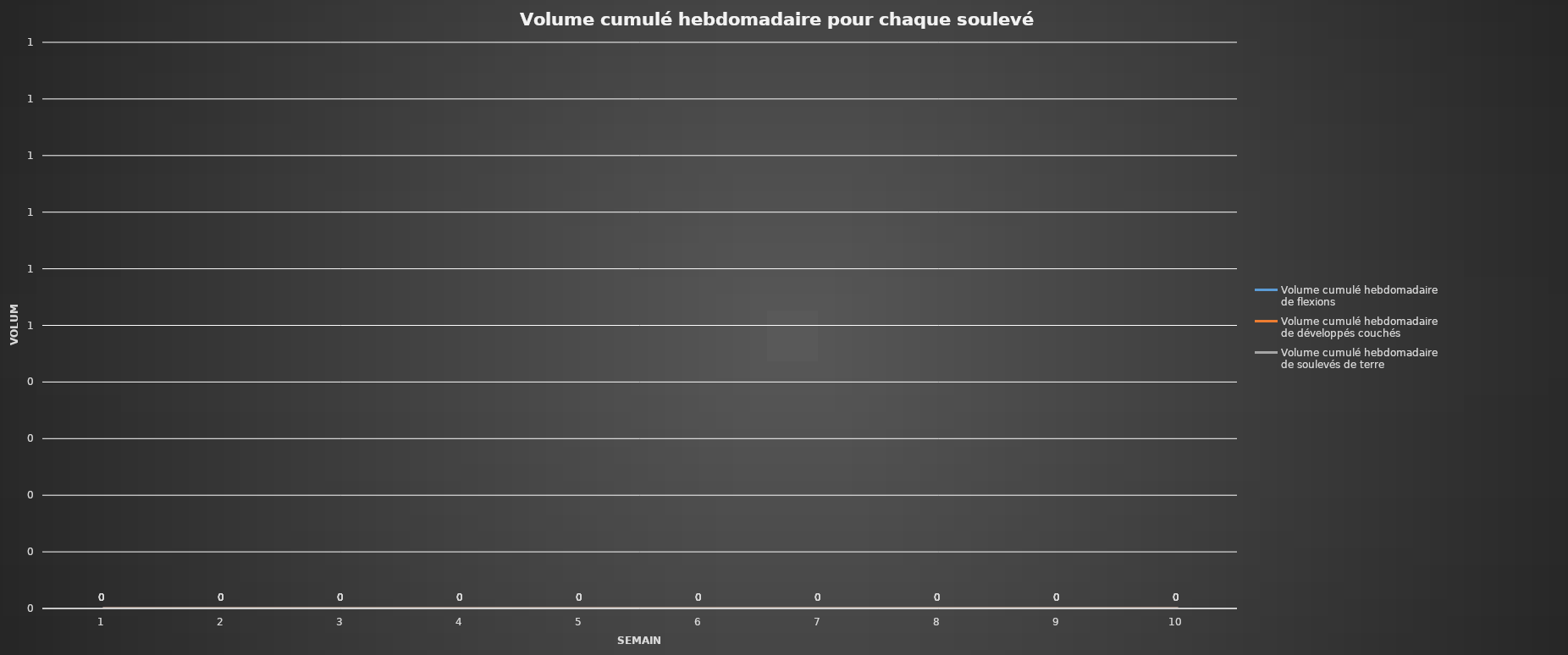
| Category | Volume cumulé hebdomadaire de flexions | Volume cumulé hebdomadaire de développés couchés | Volume cumulé hebdomadaire de soulevés de terre |
|---|---|---|---|
| 0 | 0 | 0 | 0 |
| 1 | 0 | 0 | 0 |
| 2 | 0 | 0 | 0 |
| 3 | 0 | 0 | 0 |
| 4 | 0 | 0 | 0 |
| 5 | 0 | 0 | 0 |
| 6 | 0 | 0 | 0 |
| 7 | 0 | 0 | 0 |
| 8 | 0 | 0 | 0 |
| 9 | 0 | 0 | 0 |